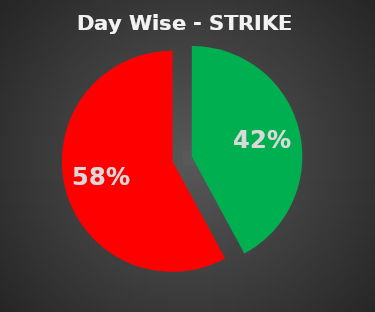
| Category | Series 0 |
|---|---|
| 0 | 0.421 |
| 1 | 0.579 |